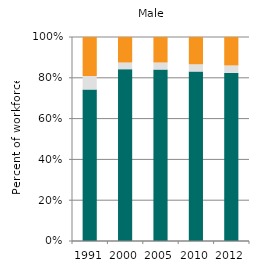
| Category | Agriculture | Industry | Services |
|---|---|---|---|
| 1991.0 | 74.269 | 6.618 | 19.113 |
| 2000.0 | 84.236 | 3.264 | 12.5 |
| 2005.0 | 84.047 | 3.456 | 12.497 |
| 2010.0 | 83.088 | 3.542 | 13.371 |
| 2012.0 | 82.394 | 3.662 | 13.945 |